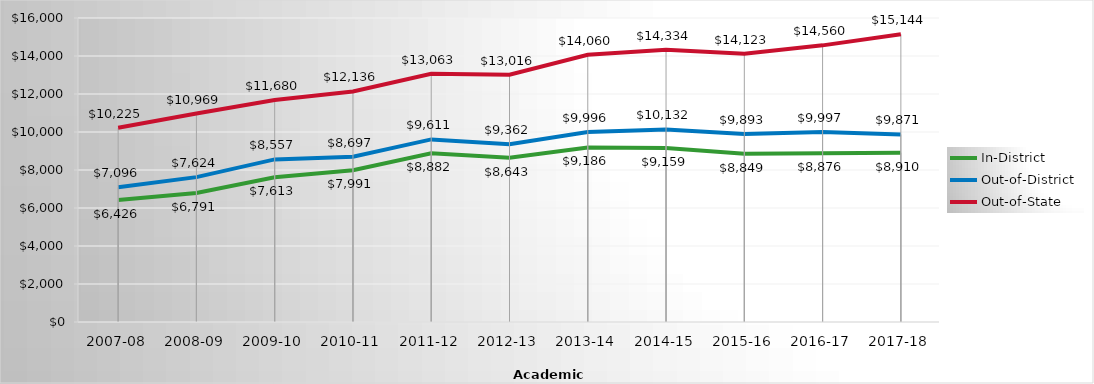
| Category | In-District | Out-of-District | Out-of-State |
|---|---|---|---|
| 2007-08 | 6426 | 7096 | 10225 |
| 2008-09 | 6791 | 7624 | 10969 |
| 2009-10 | 7613 | 8557 | 11680 |
| 2010-11 | 7991 | 8697 | 12136 |
| 2011-12 | 8882 | 9611 | 13063 |
| 2012-13 | 8643.15 | 9362 | 13016 |
| 2013-14 | 9185.83 | 9996.06 | 14060.13 |
| 2014-15 | 9159.04 | 10132.13 | 14333.65 |
| 2015-16 | 8849 | 9893 | 14123 |
| 2016-17 | 8876 | 9997 | 14560 |
| 2017-18 | 8910 | 9871 | 15144 |